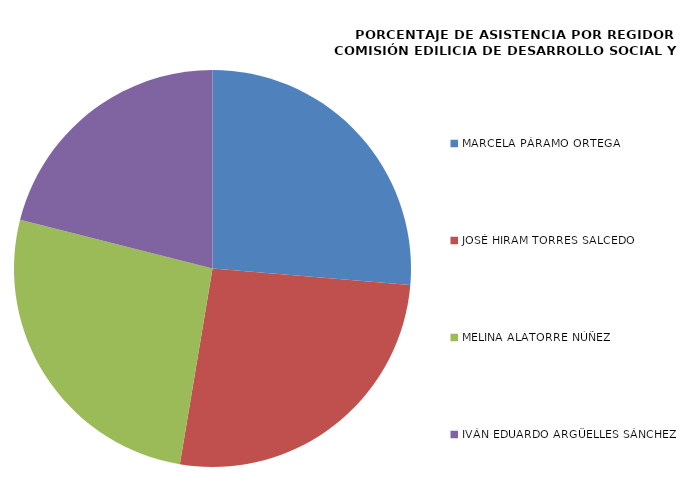
| Category | Series 0 |
|---|---|
| MARCELA PÁRAMO ORTEGA | 100 |
| JOSÉ HIRAM TORRES SALCEDO | 100 |
| MELINA ALATORRE NÚÑEZ | 100 |
| IVÁN EDUARDO ARGÜELLES SÁNCHEZ | 80 |